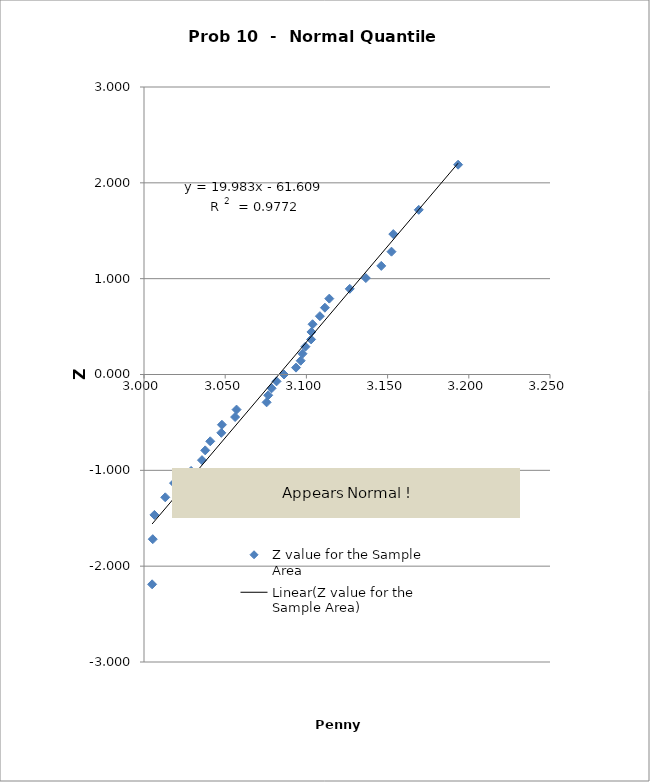
| Category | Z value for the Sample Area |
|---|---|
| 3.005 | -2.189 |
| 3.0054 | -1.718 |
| 3.0064 | -1.465 |
| 3.0131 | -1.282 |
| 3.0185 | -1.133 |
| 3.029 | -1.006 |
| 3.0357 | -0.894 |
| 3.0377 | -0.792 |
| 3.0408 | -0.697 |
| 3.0476 | -0.608 |
| 3.048 | -0.524 |
| 3.0561 | -0.444 |
| 3.057 | -0.366 |
| 3.0755 | -0.291 |
| 3.0765 | -0.217 |
| 3.0786 | -0.144 |
| 3.0816 | -0.072 |
| 3.0862 | 0 |
| 3.0936 | 0.072 |
| 3.0965 | 0.144 |
| 3.0976 | 0.217 |
| 3.0994 | 0.291 |
| 3.1029 | 0.366 |
| 3.1031 | 0.444 |
| 3.1038 | 0.524 |
| 3.1083 | 0.608 |
| 3.1114 | 0.697 |
| 3.1141 | 0.792 |
| 3.1267 | 0.894 |
| 3.1366 | 1.006 |
| 3.1461 | 1.133 |
| 3.1524 | 1.282 |
| 3.1535 | 1.465 |
| 3.1692 | 1.718 |
| 3.1934 | 2.189 |